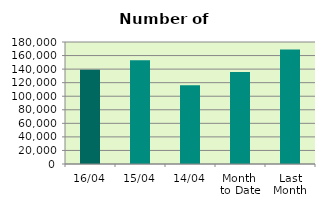
| Category | Series 0 |
|---|---|
| 16/04 | 139018 |
| 15/04 | 153050 |
| 14/04 | 116362 |
| Month 
to Date | 135655.4 |
| Last
Month | 168827.304 |